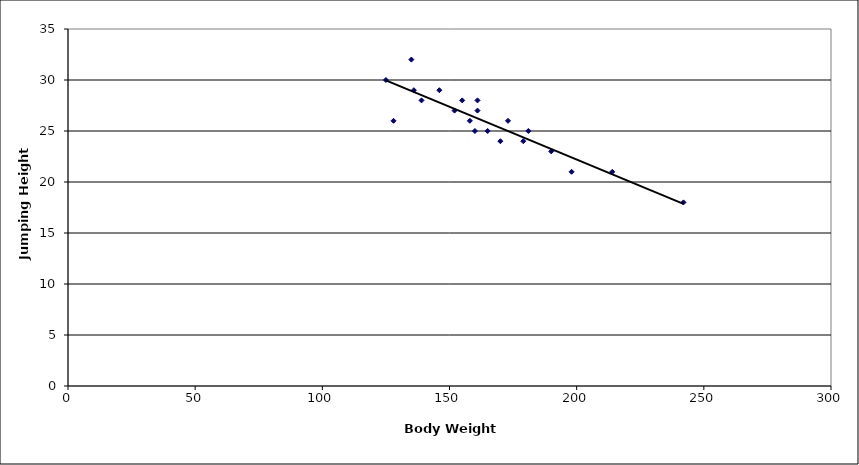
| Category | Series 0 |
|---|---|
| 125.0 | 30 |
| 128.0 | 26 |
| 135.0 | 32 |
| 136.0 | 29 |
| 139.0 | 28 |
| 146.0 | 29 |
| 152.0 | 27 |
| 155.0 | 28 |
| 158.0 | 26 |
| 160.0 | 25 |
| 161.0 | 28 |
| 161.0 | 27 |
| 165.0 | 25 |
| 170.0 | 24 |
| 173.0 | 26 |
| 179.0 | 24 |
| 181.0 | 25 |
| 190.0 | 23 |
| 198.0 | 21 |
| 214.0 | 21 |
| 242.0 | 18 |